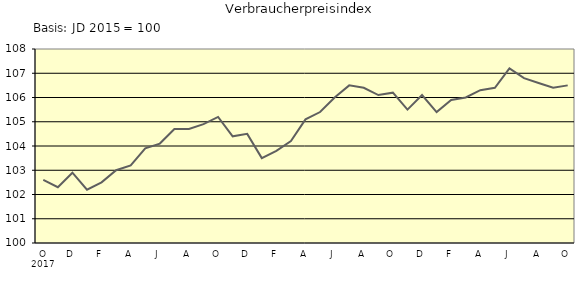
| Category | Series 0 |
|---|---|
| 0 | 102.6 |
| 1 | 102.3 |
| 2 | 102.9 |
| 3 | 102.2 |
| 4 | 102.5 |
| 5 | 103 |
| 6 | 103.2 |
| 7 | 103.9 |
| 8 | 104.1 |
| 9 | 104.7 |
| 10 | 104.7 |
| 11 | 104.9 |
| 12 | 105.2 |
| 13 | 104.4 |
| 14 | 104.5 |
| 15 | 103.5 |
| 16 | 103.8 |
| 17 | 104.2 |
| 18 | 105.1 |
| 19 | 105.4 |
| 20 | 106 |
| 21 | 106.5 |
| 22 | 106.4 |
| 23 | 106.1 |
| 24 | 106.2 |
| 25 | 105.5 |
| 26 | 106.1 |
| 27 | 105.4 |
| 28 | 105.9 |
| 29 | 106 |
| 30 | 106.3 |
| 31 | 106.4 |
| 32 | 107.2 |
| 33 | 106.8 |
| 34 | 106.6 |
| 35 | 106.4 |
| 36 | 106.5 |